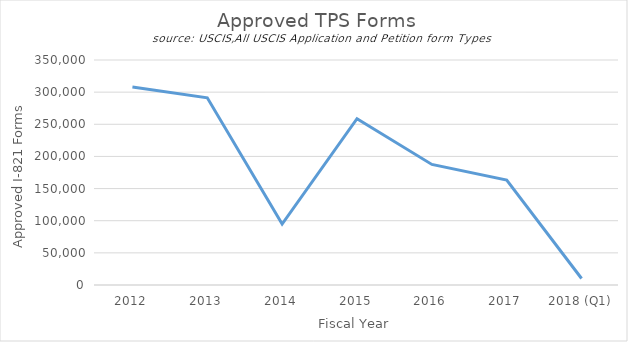
| Category | Approved TPS Forms |
|---|---|
| 2012 | 308062 |
| 2013 | 291258 |
| 2014 | 94837 |
| 2015 | 258722 |
| 2016 | 187521 |
| 2017 | 163093 |
| 2018 (Q1) | 10071 |